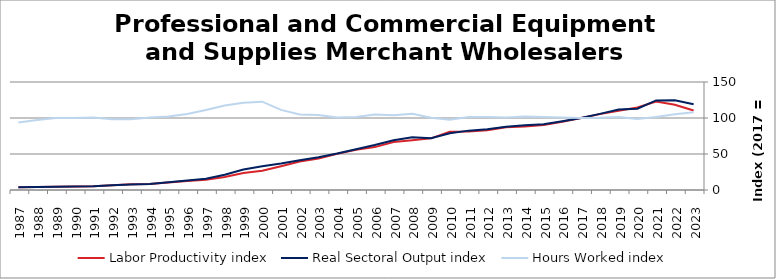
| Category | Labor Productivity index | Real Sectoral Output index | Hours Worked index |
|---|---|---|---|
| 2023.0 | 110.514 | 119.242 | 107.897 |
| 2022.0 | 118.4 | 124.592 | 105.229 |
| 2021.0 | 122.728 | 124.43 | 101.387 |
| 2020.0 | 114.703 | 112.993 | 98.509 |
| 2019.0 | 110.11 | 111.792 | 101.527 |
| 2018.0 | 105.38 | 105.756 | 100.357 |
| 2017.0 | 100 | 100 | 100 |
| 2016.0 | 94.853 | 95.394 | 100.57 |
| 2015.0 | 90.135 | 91.289 | 101.28 |
| 2014.0 | 88.122 | 90.09 | 102.233 |
| 2013.0 | 87.25 | 87.962 | 100.816 |
| 2012.0 | 83.152 | 84.409 | 101.512 |
| 2011.0 | 81.39 | 82.458 | 101.312 |
| 2010.0 | 80.985 | 78.894 | 97.418 |
| 2009.0 | 71.721 | 72.028 | 100.429 |
| 2008.0 | 69.173 | 73.183 | 105.797 |
| 2007.0 | 66.756 | 69.206 | 103.67 |
| 2006.0 | 59.584 | 62.467 | 104.84 |
| 2005.0 | 55.744 | 56.6 | 101.536 |
| 2004.0 | 50.357 | 50.776 | 100.832 |
| 2003.0 | 43.827 | 45.626 | 104.105 |
| 2002.0 | 39.467 | 41.436 | 104.989 |
| 2001.0 | 32.989 | 36.701 | 111.253 |
| 2000.0 | 26.819 | 32.896 | 122.657 |
| 1999.0 | 23.555 | 28.535 | 121.145 |
| 1998.0 | 18.051 | 21.208 | 117.492 |
| 1997.0 | 14.173 | 15.735 | 111.019 |
| 1996.0 | 12.38 | 13.059 | 105.485 |
| 1995.0 | 10.418 | 10.644 | 102.167 |
| 1994.0 | 8.431 | 8.492 | 100.731 |
| 1993.0 | 7.83 | 7.692 | 98.238 |
| 1992.0 | 6.606 | 6.497 | 98.349 |
| 1991.0 | 5.251 | 5.288 | 100.712 |
| 1990.0 | 4.774 | 4.767 | 99.852 |
| 1989.0 | 4.544 | 4.543 | 99.983 |
| 1988.0 | 4.188 | 4.07 | 97.196 |
| 1987.0 | 3.898 | 3.659 | 93.866 |